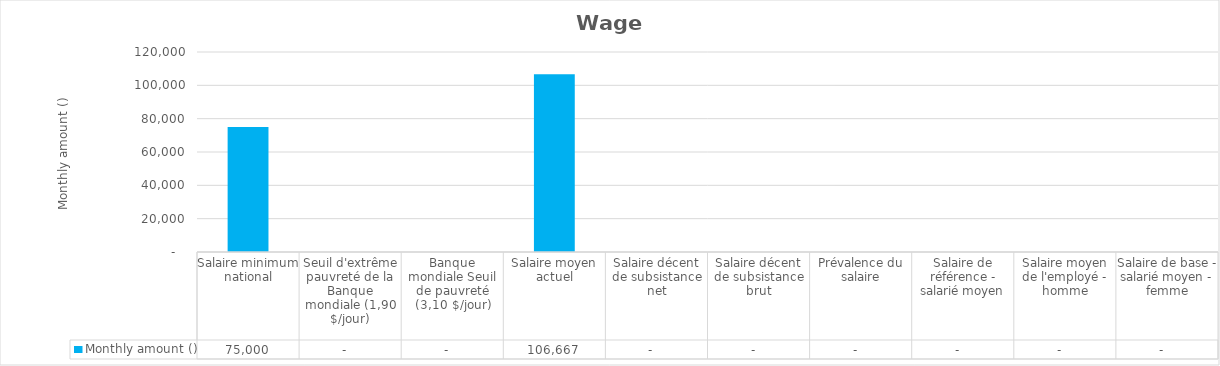
| Category |  Monthly amount ()  |
|---|---|
| Salaire minimum national | 75000 |
| Seuil d'extrême pauvreté de la Banque mondiale (1,90 $/jour) | 0 |
| Banque mondiale Seuil de pauvreté (3,10 $/jour) | 0 |
| Salaire moyen actuel | 106667 |
| Salaire décent de subsistance net | 0 |
| Salaire décent de subsistance brut | 0 |
| Prévalence du salaire | 0 |
| Salaire de référence - salarié moyen | 0 |
| Salaire moyen de l'employé - homme | 0 |
| Salaire de base - salarié moyen - femme | 0 |